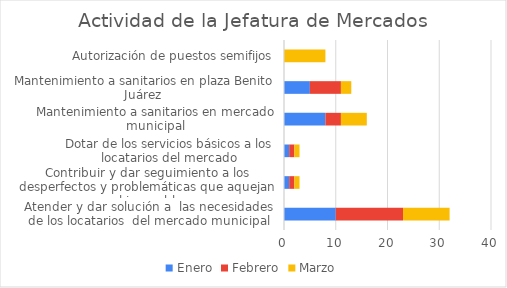
| Category | Enero | Febrero | Marzo |
|---|---|---|---|
| Atender y dar solución a  las necesidades de los locatarios  del mercado municipal | 10 | 13 | 9 |
| Contribuir y dar seguimiento a los desperfectos y problemáticas que aquejan al inmueble | 1 | 1 | 1 |
| Dotar de los servicios básicos a los locatarios del mercado | 1 | 1 | 1 |
| Mantenimiento a sanitarios en mercado municipal | 8 | 3 | 5 |
| Mantenimiento a sanitarios en plaza Benito Juárez  | 5 | 6 | 2 |
| Autorización de puestos semifijos | 0 | 0 | 8 |